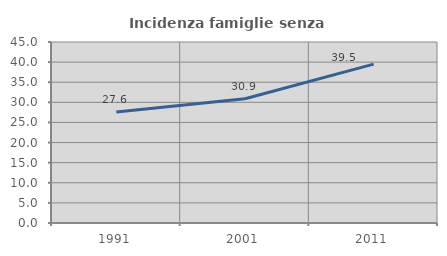
| Category | Incidenza famiglie senza nuclei |
|---|---|
| 1991.0 | 27.595 |
| 2001.0 | 30.876 |
| 2011.0 | 39.507 |